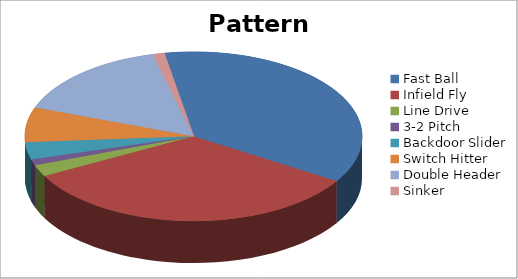
| Category | Pattern Distribution |
|---|---|
| Fast Ball | 33 |
| Infield Fly | 30 |
| Line Drive | 2 |
| 3-2 Pitch | 1 |
| Backdoor Slider | 3 |
| Switch Hitter | 6 |
| Double Header | 14 |
| Sinker | 1 |